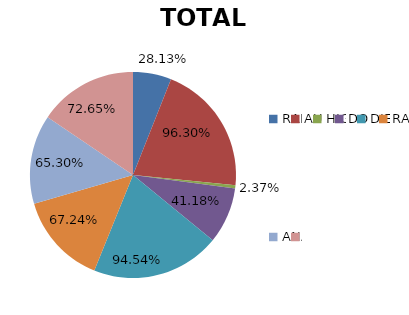
| Category | Series 0 |
|---|---|
| RADIODIAGNÓSTICO | 0.281 |
| AUDIOPRÉTESIS | 0.963 |
| HIGIENE BUCODENTAL | 0.024 |
| DOCUMENTACION | 0.412 |
| DIETÉTICA | 0.945 |
| RADIOTERAPIA | 0.672 |
| ANATOMÍA | 0.653 |